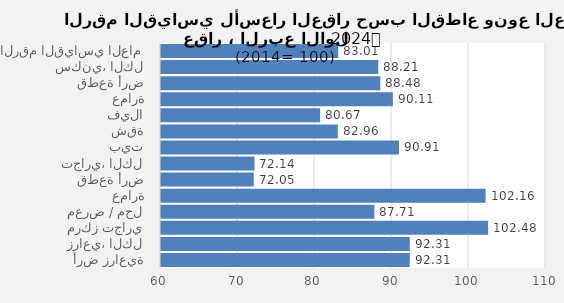
| Category | 2024 |
|---|---|
| الرقم القياسي العام | 83.013 |
| سكني، الكل | 88.213 |
| قطعة أرض | 88.478 |
| عمارة | 90.114 |
| فيلا | 80.67 |
| شقة | 82.964 |
| بيت | 90.906 |
| تجاري، الكل | 72.141 |
| قطعة أرض | 72.046 |
| عمارة | 102.156 |
| معرض / محل | 87.711 |
| مركز تجاري | 102.482 |
| زراعي، الكل | 92.306 |
| أرض زراعية | 92.306 |